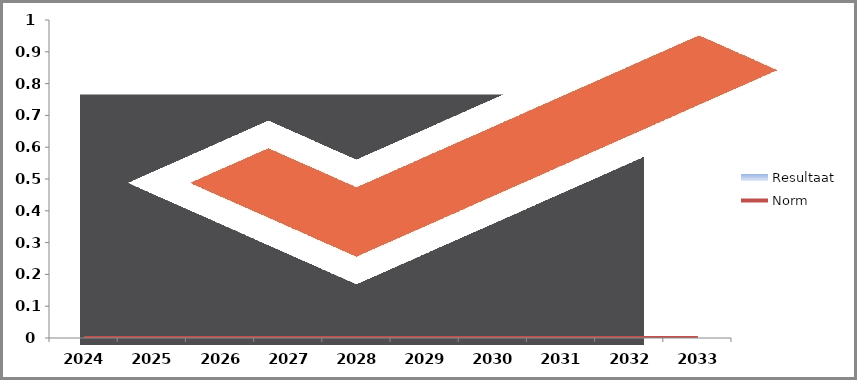
| Category | Resultaat |
|---|---|
| 2024.0 | 0 |
| 2025.0 | 0 |
| 2026.0 | 0 |
| 2027.0 | 0 |
| 2028.0 | 0 |
| 2029.0 | 0 |
| 2030.0 | 0 |
| 2031.0 | 0 |
| 2032.0 | 0 |
| 2033.0 | 0 |